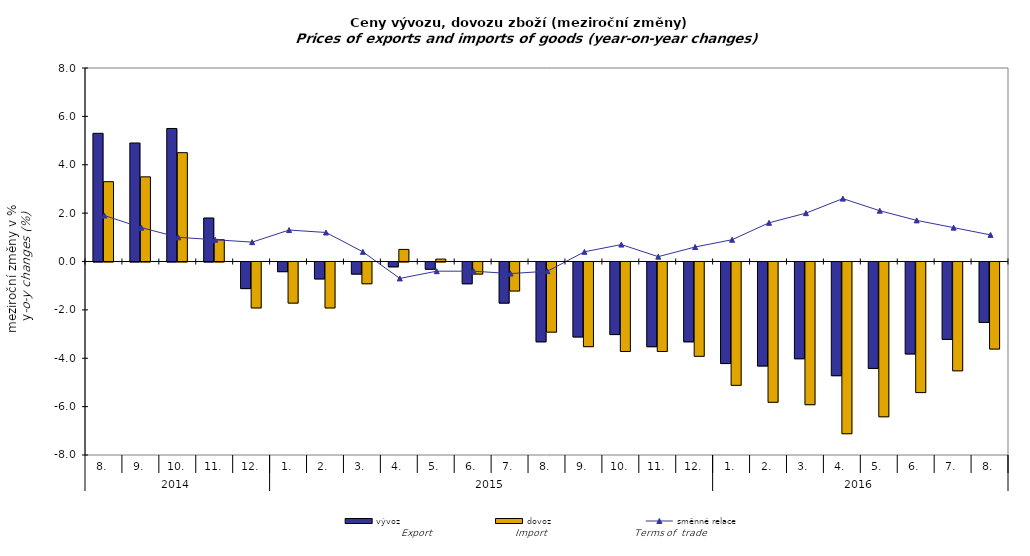
| Category | vývoz | dovoz |
|---|---|---|
| 0 | 5.3 | 3.3 |
| 1 | 4.9 | 3.5 |
| 2 | 5.5 | 4.5 |
| 3 | 1.8 | 0.9 |
| 4 | -1.1 | -1.9 |
| 5 | -0.4 | -1.7 |
| 6 | -0.7 | -1.9 |
| 7 | -0.5 | -0.9 |
| 8 | -0.2 | 0.5 |
| 9 | -0.3 | 0.1 |
| 10 | -0.9 | -0.5 |
| 11 | -1.7 | -1.2 |
| 12 | -3.3 | -2.9 |
| 13 | -3.1 | -3.5 |
| 14 | -3 | -3.7 |
| 15 | -3.5 | -3.7 |
| 16 | -3.3 | -3.9 |
| 17 | -4.2 | -5.1 |
| 18 | -4.3 | -5.8 |
| 19 | -4 | -5.9 |
| 20 | -4.7 | -7.1 |
| 21 | -4.4 | -6.4 |
| 22 | -3.8 | -5.4 |
| 23 | -3.2 | -4.5 |
| 24 | -2.5 | -3.6 |